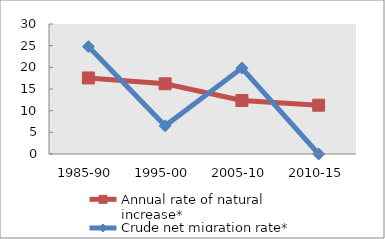
| Category | Annual rate of natural increase* | Crude net migration rate* |
|---|---|---|
| 1985-90 | 17.55 | 24.793 |
| 1995-00 | 16.207 | 6.501 |
| 2005-10 | 12.351 | 19.829 |
| 2010-15 | 11.259 | 0 |